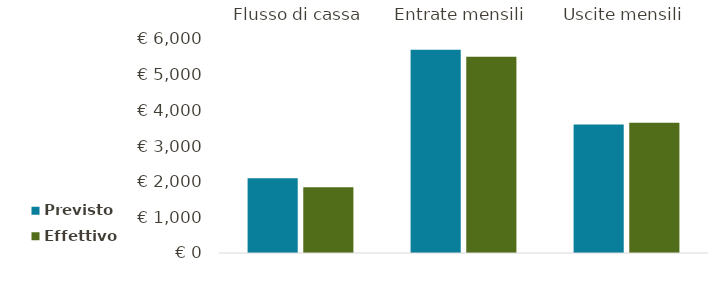
| Category | Previsto | Effettivo |
|---|---|---|
| Flusso di cassa | 2097 | 1845 |
| Entrate mensili | 5700 | 5500 |
| Uscite mensili | 3603 | 3655 |